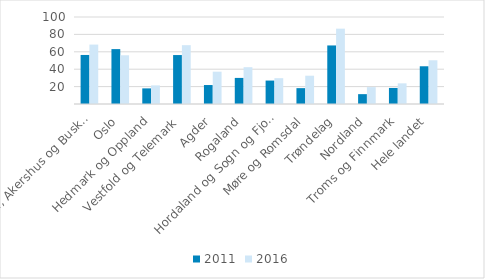
| Category | 2011 | 2016 |
|---|---|---|
| Østfold, Akershus og Buskerud | 56.365 | 68.297 |
| Oslo | 63.095 | 56.004 |
| Hedmark og Oppland | 17.953 | 21.412 |
| Vestfold og Telemark | 56.259 | 67.623 |
| Agder | 21.801 | 37.144 |
| Rogaland | 29.98 | 42.304 |
| Hordaland og Sogn og Fjordane | 26.939 | 29.673 |
| Møre og Romsdal | 18.227 | 32.522 |
| Trøndelag | 67.299 | 86.587 |
| Nordland | 11.324 | 19.407 |
| Troms og Finnmark | 18.446 | 23.734 |
| Hele landet | 43.369 | 50.263 |